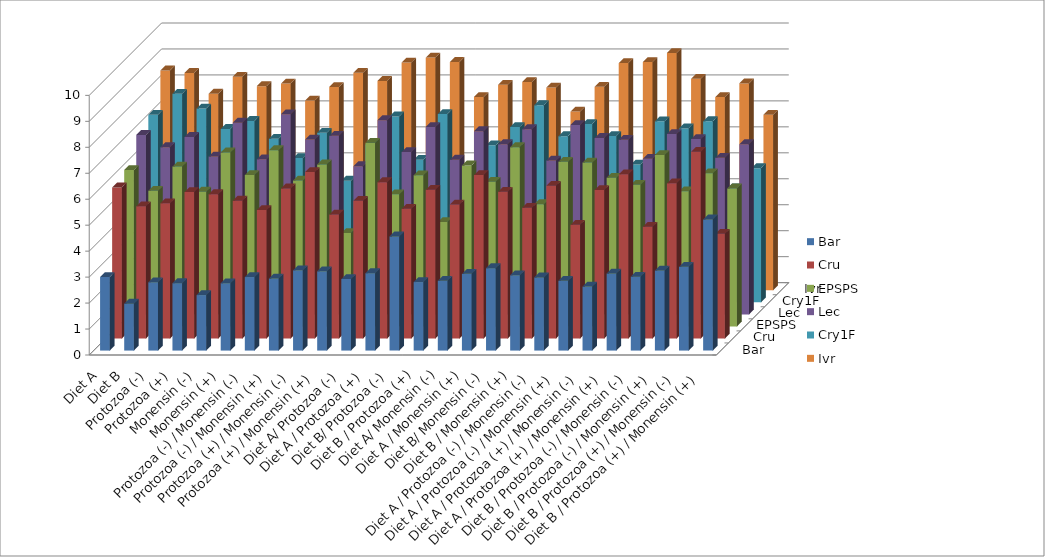
| Category | Bar | Cru | EPSPS | Lec | Cry1F | Ivr |
|---|---|---|---|---|---|---|
| Diet A | 2.835 | 5.82 | 6.025 | 6.913 | 7.226 | 8.467 |
| Diet B | 1.805 | 5.091 | 5.224 | 6.442 | 8.033 | 8.371 |
| Protozoa (-) | 2.631 | 5.21 | 6.157 | 6.834 | 7.466 | 7.571 |
| Protozoa (+) | 2.595 | 5.64 | 5.191 | 6.077 | 6.678 | 8.225 |
| Monensin (-) | 2.137 | 5.56 | 6.702 | 7.383 | 6.986 | 7.862 |
| Monensin (+) | 2.593 | 5.31 | 5.833 | 5.974 | 6.3 | 7.961 |
| Protozoa (-) / Monensin (-) | 2.831 | 4.948 | 6.789 | 7.709 | 5.556 | 7.305 |
| Protozoa (-) / Monensin (+) | 2.776 | 5.782 | 5.617 | 6.731 | 6.533 | 7.829 |
| Protozoa (+) / Monensin (-) | 3.091 | 6.409 | 6.242 | 6.878 | 4.685 | 8.374 |
| Protozoa (+) / Monensin (+) | 3.052 | 4.775 | 3.6 | 5.708 | 6.083 | 8.063 |
| Diet A/ Protozoa (-) | 2.758 | 5.304 | 7.075 | 7.48 | 7.159 | 8.77 |
| Diet A / Protozoa (+) | 2.98 | 6.021 | 5.088 | 6.252 | 5.49 | 8.962 |
| Diet B/ Protozoa (-) | 4.397 | 4.995 | 5.823 | 7.219 | 7.253 | 8.796 |
| Diet B / Protozoa (+) | 2.638 | 5.725 | 4.022 | 5.959 | 4.89 | 7.443 |
| Diet A/ Monensin (-) | 2.689 | 5.158 | 6.202 | 7.056 | 6.047 | 7.914 |
| Diet A / Monensin (+) | 2.954 | 6.295 | 5.575 | 6.556 | 6.749 | 8.021 |
| Diet B/ Monensin (-) | 3.173 | 5.654 | 6.905 | 7.133 | 7.593 | 7.807 |
| Diet B / Monensin (+) | 2.9 | 5.035 | 4.71 | 5.923 | 6.4 | 6.882 |
| Diet A / Protozoa (-) / Monensin (-) | 2.816 | 5.885 | 6.341 | 7.294 | 6.87 | 7.835 |
| Diet A / Protozoa (-) / Monensin (+) | 2.687 | 4.377 | 6.31 | 6.796 | 6.405 | 8.751 |
| Diet A / Protozoa (+) / Monensin (-) | 2.463 | 5.72 | 5.726 | 6.725 | 5.306 | 8.789 |
| Diet A / Protozoa (+) / Monensin (+) | 2.968 | 6.322 | 5.454 | 5.995 | 6.973 | 9.139 |
| Diet B / Protozoa (-) / Monensin (-) | 2.845 | 4.301 | 6.603 | 6.948 | 6.698 | 8.142 |
| Diet B / Protozoa (-) / Monensin (+) | 3.084 | 5.975 | 5.207 | 6.751 | 6.978 | 7.441 |
| Diet B / Protozoa (+) / Monensin (-) | 3.227 | 7.192 | 5.901 | 6.028 | 4.39 | 7.968 |
| Diet B / Protozoa (+) / Monensin (+) | 5.052 | 4.033 | 5.315 | 6.555 | 5.168 | 6.761 |